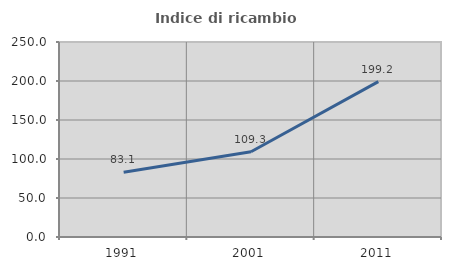
| Category | Indice di ricambio occupazionale  |
|---|---|
| 1991.0 | 83.051 |
| 2001.0 | 109.302 |
| 2011.0 | 199.153 |